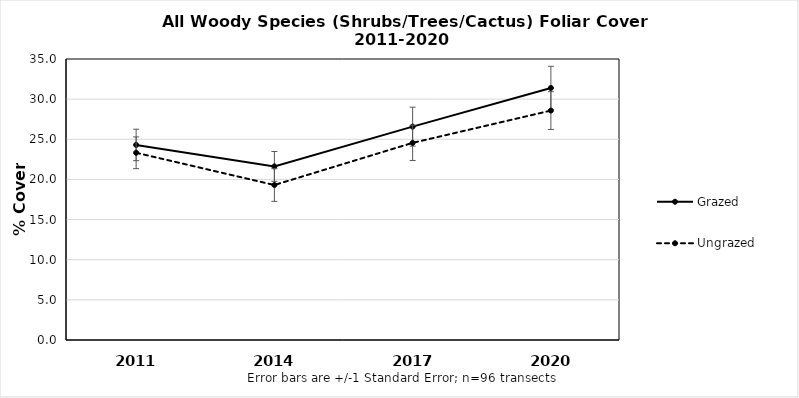
| Category | Grazed | Ungrazed |
|---|---|---|
| 2011.0 | 24.297 | 23.322 |
| 2014.0 | 21.621 | 19.303 |
| 2017.0 | 26.574 | 24.557 |
| 2020.0 | 31.389 | 28.574 |